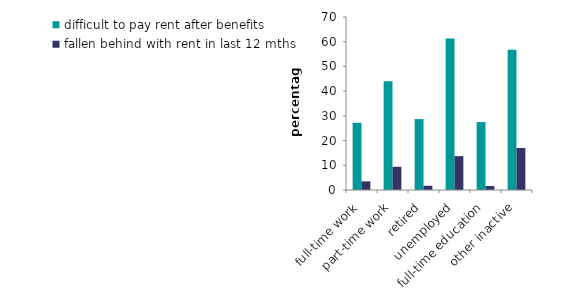
| Category | difficult to pay rent after benefits | fallen behind with rent in last 12 mths |
|---|---|---|
| full-time work | 27.2 | 3.5 |
| part-time work | 44 | 9.4 |
| retired | 28.7 | 1.7 |
| unemployed | 61.3 | 13.7 |
| full-time education | 27.5 | 1.6 |
| other inactive | 56.7 | 17 |